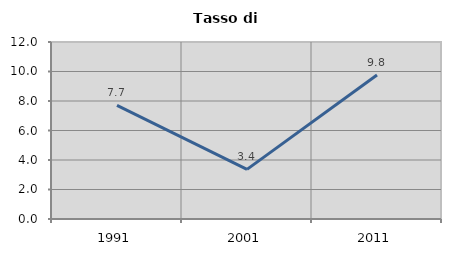
| Category | Tasso di disoccupazione   |
|---|---|
| 1991.0 | 7.708 |
| 2001.0 | 3.363 |
| 2011.0 | 9.76 |